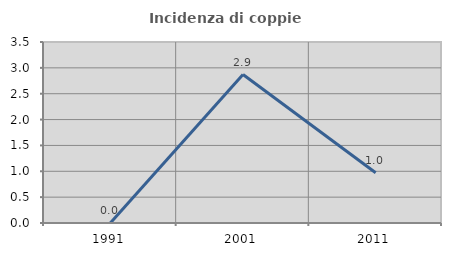
| Category | Incidenza di coppie miste |
|---|---|
| 1991.0 | 0 |
| 2001.0 | 2.871 |
| 2011.0 | 0.971 |